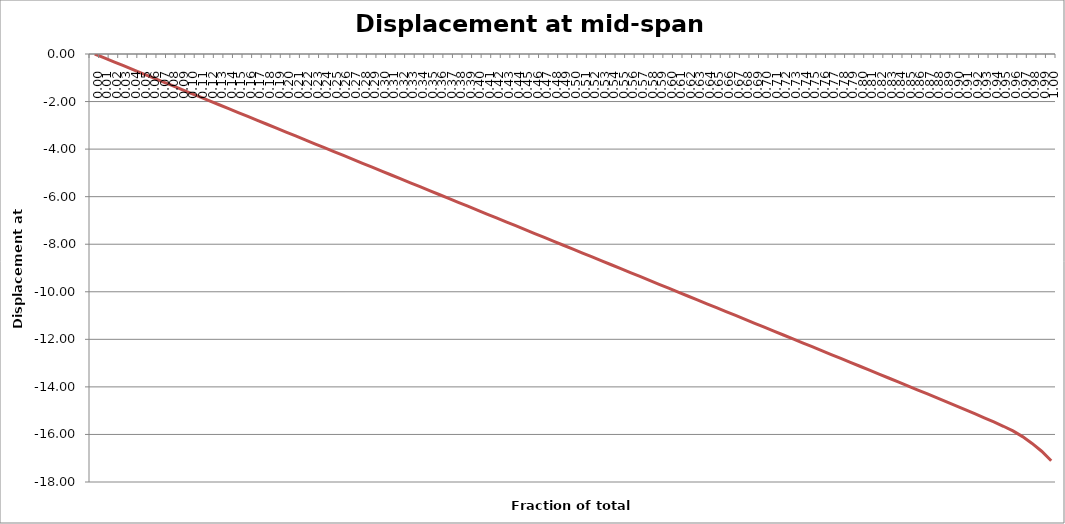
| Category | Displacement at mid-span [mm] |
|---|---|
| 0.0 | 0 |
| 0.01 | -0.164 |
| 0.02 | -0.328 |
| 0.03 | -0.492 |
| 0.04 | -0.657 |
| 0.05 | -0.821 |
| 0.06 | -0.985 |
| 0.06999999999999999 | -1.149 |
| 0.08 | -1.313 |
| 0.09 | -1.477 |
| 0.1 | -1.641 |
| 0.11000000000000001 | -1.806 |
| 0.12 | -1.97 |
| 0.13 | -2.134 |
| 0.13999999999999999 | -2.298 |
| 0.15 | -2.462 |
| 0.16 | -2.626 |
| 0.16999999999999998 | -2.79 |
| 0.18 | -2.954 |
| 0.19 | -3.119 |
| 0.2 | -3.283 |
| 0.21000000000000002 | -3.447 |
| 0.22000000000000003 | -3.611 |
| 0.22999999999999998 | -3.775 |
| 0.24 | -3.939 |
| 0.25 | -4.104 |
| 0.26 | -4.268 |
| 0.27 | -4.432 |
| 0.27999999999999997 | -4.596 |
| 0.29 | -4.76 |
| 0.3 | -4.924 |
| 0.31 | -5.088 |
| 0.32 | -5.252 |
| 0.32999999999999996 | -5.417 |
| 0.33999999999999997 | -5.581 |
| 0.35 | -5.745 |
| 0.36 | -5.909 |
| 0.37 | -6.073 |
| 0.38 | -6.237 |
| 0.39 | -6.402 |
| 0.4 | -6.566 |
| 0.41 | -6.73 |
| 0.42000000000000004 | -6.894 |
| 0.43 | -7.058 |
| 0.44000000000000006 | -7.222 |
| 0.45 | -7.386 |
| 0.45999999999999996 | -7.55 |
| 0.47000000000000003 | -7.715 |
| 0.48 | -7.879 |
| 0.49000000000000005 | -8.043 |
| 0.5 | -8.207 |
| 0.51 | -8.371 |
| 0.52 | -8.535 |
| 0.53 | -8.699 |
| 0.54 | -8.864 |
| 0.55 | -9.028 |
| 0.5599999999999999 | -9.192 |
| 0.5700000000000001 | -9.356 |
| 0.58 | -9.52 |
| 0.5900000000000001 | -9.684 |
| 0.6 | -9.848 |
| 0.61 | -10.013 |
| 0.62 | -10.177 |
| 0.63 | -10.341 |
| 0.64 | -10.505 |
| 0.65 | -10.669 |
| 0.6599999999999999 | -10.833 |
| 0.67 | -10.997 |
| 0.6799999999999999 | -11.162 |
| 0.6900000000000001 | -11.326 |
| 0.7 | -11.49 |
| 0.71 | -11.654 |
| 0.72 | -11.818 |
| 0.73 | -11.982 |
| 0.74 | -12.146 |
| 0.75 | -12.311 |
| 0.76 | -12.475 |
| 0.77 | -12.639 |
| 0.78 | -12.803 |
| 0.79 | -12.967 |
| 0.8 | -13.132 |
| 0.8099999999999999 | -13.296 |
| 0.82 | -13.461 |
| 0.8300000000000001 | -13.626 |
| 0.8400000000000001 | -13.79 |
| 0.85 | -13.955 |
| 0.86 | -14.121 |
| 0.8699999999999999 | -14.287 |
| 0.8800000000000001 | -14.453 |
| 0.89 | -14.62 |
| 0.9 | -14.788 |
| 0.9099999999999999 | -14.957 |
| 0.9199999999999999 | -15.128 |
| 0.93 | -15.3 |
| 0.9400000000000001 | -15.476 |
| 0.95 | -15.656 |
| 0.96 | -15.852 |
| 0.97 | -16.09 |
| 0.9800000000000001 | -16.377 |
| 0.99 | -16.706 |
| 1.0 | -17.104 |